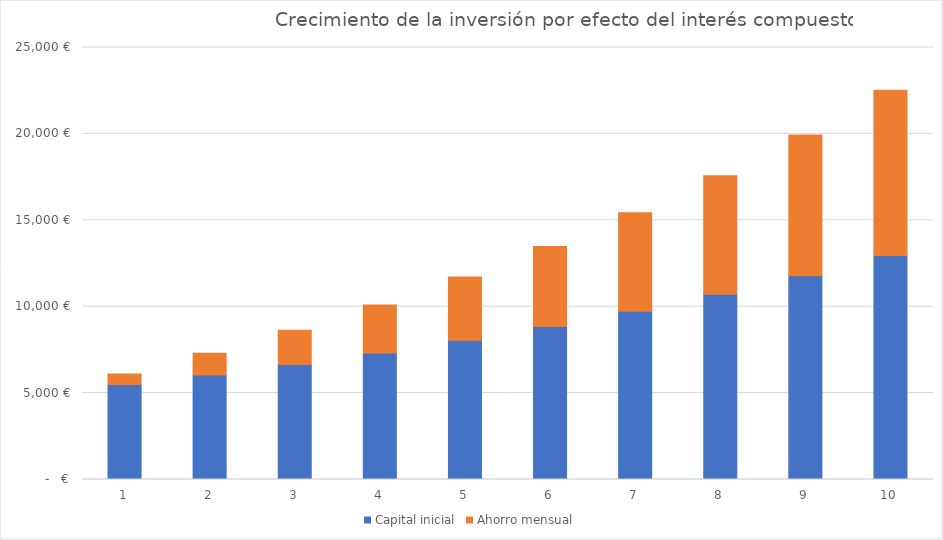
| Category | Capital inicial | Ahorro mensual |
|---|---|---|
| 0 | 5500 | 600 |
| 1 | 6050 | 1260 |
| 2 | 6655 | 1986 |
| 3 | 7320.5 | 2784.6 |
| 4 | 8052.55 | 3663.06 |
| 5 | 8857.805 | 4629.366 |
| 6 | 9743.586 | 5692.303 |
| 7 | 10717.944 | 6861.533 |
| 8 | 11789.738 | 8147.686 |
| 9 | 12968.712 | 9562.455 |